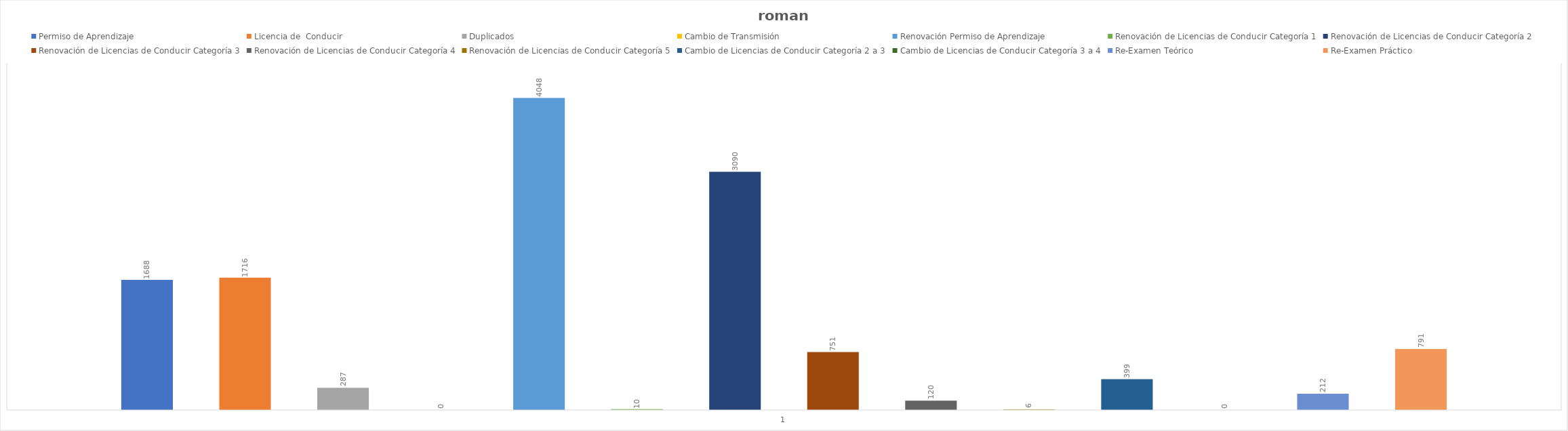
| Category | Permiso de Aprendizaje  | Licencia de  Conducir  | Duplicados  | Cambio de Transmisión  | Renovación Permiso de Aprendizaje | Renovación de Licencias de Conducir Categoría 1 | Renovación de Licencias de Conducir Categoría 2 | Renovación de Licencias de Conducir Categoría 3 | Renovación de Licencias de Conducir Categoría 4 | Renovación de Licencias de Conducir Categoría 5 | Cambio de Licencias de Conducir Categoría 2 a 3 | Cambio de Licencias de Conducir Categoría 3 a 4 | Re-Examen Teórico | Re-Examen Práctico |
|---|---|---|---|---|---|---|---|---|---|---|---|---|---|---|
| 0 | 1688 | 1716 | 287 | 0 | 4048 | 10 | 3090 | 751 | 120 | 6 | 399 | 0 | 212 | 791 |